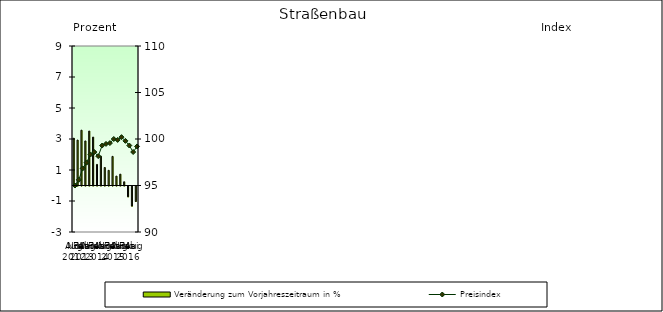
| Category | Veränderung zum Vorjahreszeitraum in % |
|---|---|
| 0 | 3.048 |
| 1 | 2.93 |
| 2 | 3.568 |
| 3 | 2.873 |
| 4 | 3.512 |
| 5 | 3.122 |
| 6 | 1.36 |
| 7 | 1.892 |
| 8 | 1.161 |
| 9 | 0.98 |
| 10 | 1.878 |
| 11 | 0.607 |
| 12 | 0.731 |
| 13 | 0.24 |
| 14 | -0.7 |
| 15 | -1.3 |
| 16 | -1 |